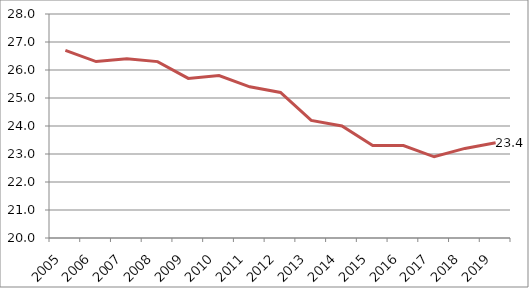
| Category | Series 1 |
|---|---|
| 2005.0 | 26.7 |
| 2006.0 | 26.3 |
| 2007.0 | 26.4 |
| 2008.0 | 26.3 |
| 2009.0 | 25.7 |
| 2010.0 | 25.8 |
| 2011.0 | 25.4 |
| 2012.0 | 25.2 |
| 2013.0 | 24.2 |
| 2014.0 | 24 |
| 2015.0 | 23.3 |
| 2016.0 | 23.3 |
| 2017.0 | 22.9 |
| 2018.0 | 23.2 |
| 2019.0 | 23.4 |